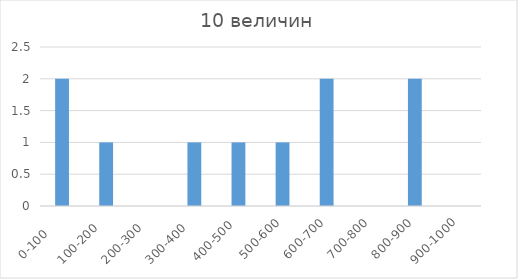
| Category | Series 0 |
|---|---|
| 0-100     | 2 |
| 100-200   | 1 |
| 200-300   | 0 |
| 300-400   | 1 |
| 400-500  | 1 |
| 500-600 | 1 |
| 600-700 | 2 |
| 700-800 | 0 |
| 800-900 | 2 |
| 900-1000 | 0 |